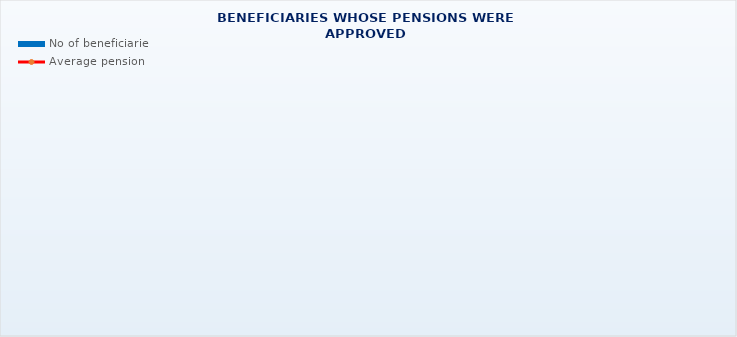
| Category | No of beneficiaries |
|---|---|
| Authorised officials in internal affairs, judicial officers and workers engaged in demining work: | 17264 |
| Pension beneficiaries entitled under the Fire Services Act (Official Gazette 125/19) | 267 |
| Active military personnel - DVO  | 15994 |
| Croatian Homeland Army veterans mobilised from 1941 to 1945 | 2401 |
| Former political prisoners | 2296 |
| Croatian Veterans from the Homeland War - ZOHBDR (Act on Croatian Homeland War Veterans and Their Family Members) | 70977 |
| Pensions approved under general regulations and determined according to the Act on the Rights of Croatian Homeland War Veterans and their Family Members (ZOHBDR), in 2017 (Art. 27, 35, 48 and 49, paragraph 2)    | 53837 |
| Former Yugoslav People's Army members - JNA   | 4165 |
| Former Yugoslav People's Army members - JNA - Art. 185 of Pension Insurance Act (ZOMO)  | 158 |
| National Liberation War veterans - NOR | 6111 |
| Members of the Croatian Parliament, members of the Government, judges of the Constitutional Court and the Auditor General | 684 |
| Members of the Parliamentary Executive Council and administratively retired federal civil servants  (relates to the former SFRY) | 71 |
| Former officials of federal bodies o the former SFRJ -  Article 38 of the Pension Insurance Act (ZOMO) | 22 |
| Full members of the Croatian Academy of Sciences and Arts - HAZU | 130 |
| Miners from the Istrian coal mines "Tupljak" d.d. Labin  | 249 |
| Workers professionally exposed to asbestos | 840 |
| Insurees - crew members on a ship in international and national navigation  - Article  129, paragraph 2 of the Maritime Code | 198 |
| Members of the Croatian Defence Council - HVO  | 6745 |